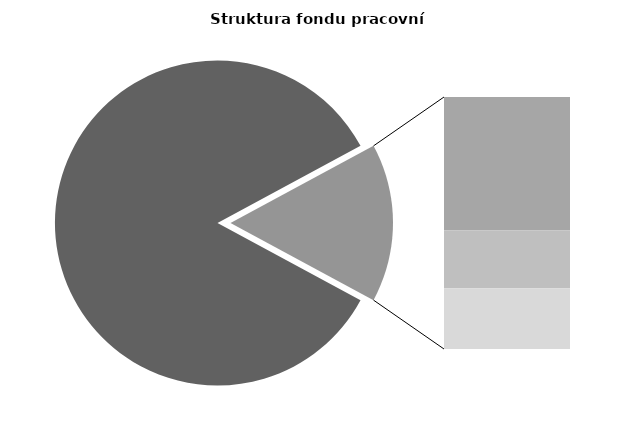
| Category | Series 0 |
|---|---|
| Průměrná měsíční odpracovaná doba bez přesčasu | 144.211 |
| Dovolená | 14.255 |
| Nemoc | 6.21 |
| Jiné | 6.484 |